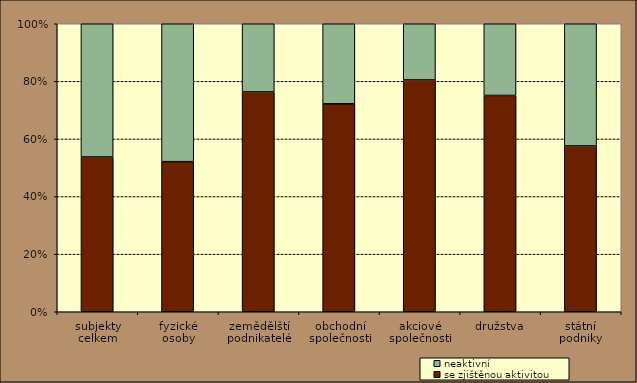
| Category | se zjištěnou aktivitou | neaktivní |
|---|---|---|
| subjekty
celkem | 53.745 | 46.255 |
| fyzické
osoby | 52.119 | 47.881 |
| zemědělští podnikatelé | 76.33 | 23.67 |
| obchodní
společnosti | 72.205 | 27.795 |
| akciové
společnosti | 80.492 | 19.508 |
| družstva | 75.102 | 24.898 |
| státní
podniky | 57.576 | 42.424 |